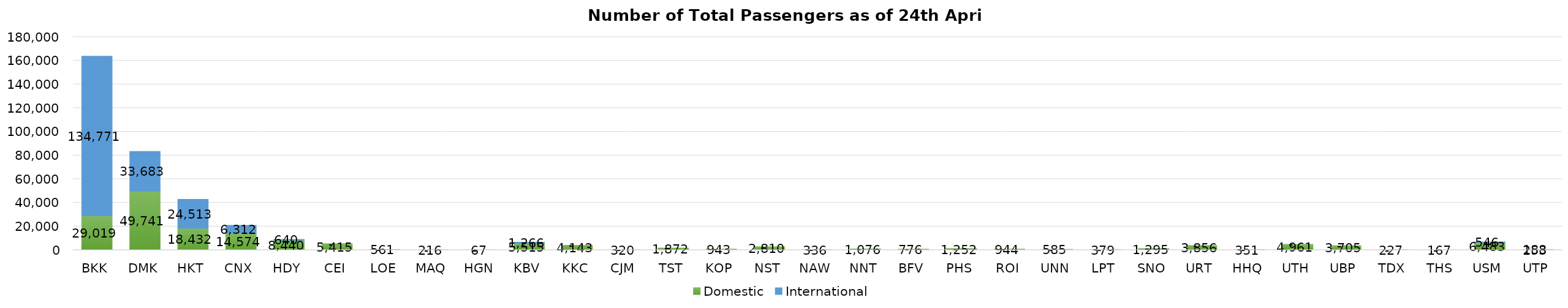
| Category | Domestic | International |
|---|---|---|
| BKK | 29019 | 134771 |
| DMK | 49741 | 33683 |
| HKT | 18432 | 24513 |
| CNX | 14574 | 6312 |
| HDY | 8440 | 640 |
| CEI | 5415 | 0 |
| LOE | 561 | 0 |
| MAQ | 216 | 0 |
| HGN | 67 | 0 |
| KBV | 5515 | 1266 |
| KKC | 4143 | 0 |
| CJM | 320 | 0 |
| TST | 1872 | 0 |
| KOP | 943 | 0 |
| NST | 2810 | 0 |
| NAW | 336 | 0 |
| NNT | 1076 | 0 |
| BFV | 776 | 0 |
| PHS | 1252 | 0 |
| ROI | 944 | 0 |
| UNN | 585 | 0 |
| LPT | 379 | 0 |
| SNO | 1295 | 0 |
| URT | 3856 | 0 |
| HHQ | 351 | 0 |
| UTH | 4961 | 0 |
| UBP | 3705 | 0 |
| TDX | 227 | 0 |
| THS | 167 | 0 |
| USM | 6483 | 546 |
| UTP | 253 | 188 |